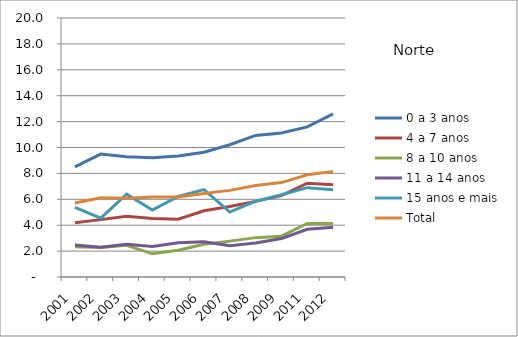
| Category | 0 a 3 anos | 4 a 7 anos | 8 a 10 anos | 11 a 14 anos | 15 anos e mais | Total |
|---|---|---|---|---|---|---|
| 2001.0 | 8.51 | 4.19 | 2.33 | 2.48 | 5.38 | 5.72 |
| 2002.0 | 9.49 | 4.43 | 2.27 | 2.3 | 4.54 | 6.11 |
| 2003.0 | 9.28 | 4.69 | 2.45 | 2.53 | 6.4 | 6.08 |
| 2004.0 | 9.21 | 4.51 | 1.79 | 2.36 | 5.17 | 6.17 |
| 2005.0 | 9.34 | 4.46 | 2.06 | 2.64 | 6.22 | 6.18 |
| 2006.0 | 9.63 | 5.11 | 2.53 | 2.72 | 6.75 | 6.45 |
| 2007.0 | 10.21 | 5.44 | 2.77 | 2.42 | 5.01 | 6.69 |
| 2008.0 | 10.93 | 5.84 | 3.04 | 2.62 | 5.85 | 7.06 |
| 2009.0 | 11.12 | 6.28 | 3.15 | 2.97 | 6.35 | 7.29 |
| 2011.0 | 11.59 | 7.24 | 4.13 | 3.69 | 6.9 | 7.89 |
| 2012.0 | 12.6 | 7.13 | 4.13 | 3.85 | 6.74 | 8.14 |